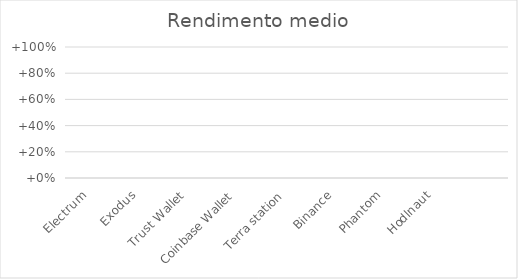
| Category | Rendimento medio |
|---|---|
| Electrum | 0 |
| Exodus | 0 |
| Trust Wallet | 0 |
| Coinbase Wallet | 0 |
| Terra station | 0 |
| Binance | 0 |
| Phantom | 0 |
| Hodlnaut | 0 |